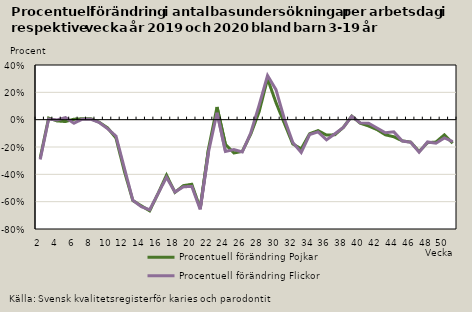
| Category | Procentuell förändring |
|---|---|
| 2.0 | -0.291 |
| 3.0 | 0.004 |
| 4.0 | -0.002 |
| 5.0 | 0.015 |
| 6.0 | -0.026 |
| 7.0 | 0.003 |
| 8.0 | 0.004 |
| 9.0 | -0.02 |
| 10.0 | -0.066 |
| 11.0 | -0.12 |
| 12.0 | -0.356 |
| 13.0 | -0.589 |
| 14.0 | -0.636 |
| 15.0 | -0.659 |
| 16.0 | -0.541 |
| 17.0 | -0.421 |
| 18.0 | -0.53 |
| 19.0 | -0.491 |
| 20.0 | -0.488 |
| 21.0 | -0.656 |
| 22.0 | -0.233 |
| 23.0 | 0.051 |
| 24.0 | -0.232 |
| 25.0 | -0.219 |
| 26.0 | -0.237 |
| 27.0 | -0.098 |
| 28.0 | 0.107 |
| 29.0 | 0.323 |
| 30.0 | 0.22 |
| 31.0 | 0.005 |
| 32.0 | -0.168 |
| 33.0 | -0.24 |
| 34.0 | -0.109 |
| 35.0 | -0.09 |
| 36.0 | -0.148 |
| 37.0 | -0.103 |
| 38.0 | -0.057 |
| 39.0 | 0.025 |
| 40.0 | -0.023 |
| 41.0 | -0.026 |
| 42.0 | -0.061 |
| 43.0 | -0.096 |
| 44.0 | -0.089 |
| 45.0 | -0.157 |
| 46.0 | -0.165 |
| 47.0 | -0.238 |
| 48.0 | -0.163 |
| 49.0 | -0.172 |
| 50.0 | -0.134 |
| 51.0 | -0.16 |